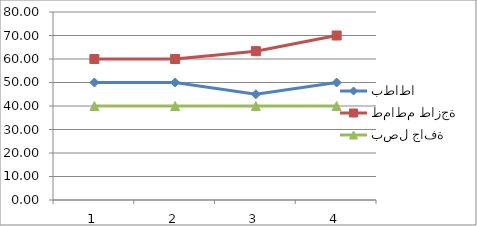
| Category | بطاطا | طماطم طازجة | بصل جافة |
|---|---|---|---|
| 0 | 50 | 60 | 40 |
| 1 | 50 | 60 | 40 |
| 2 | 45 | 63.333 | 40 |
| 3 | 50 | 70 | 40 |